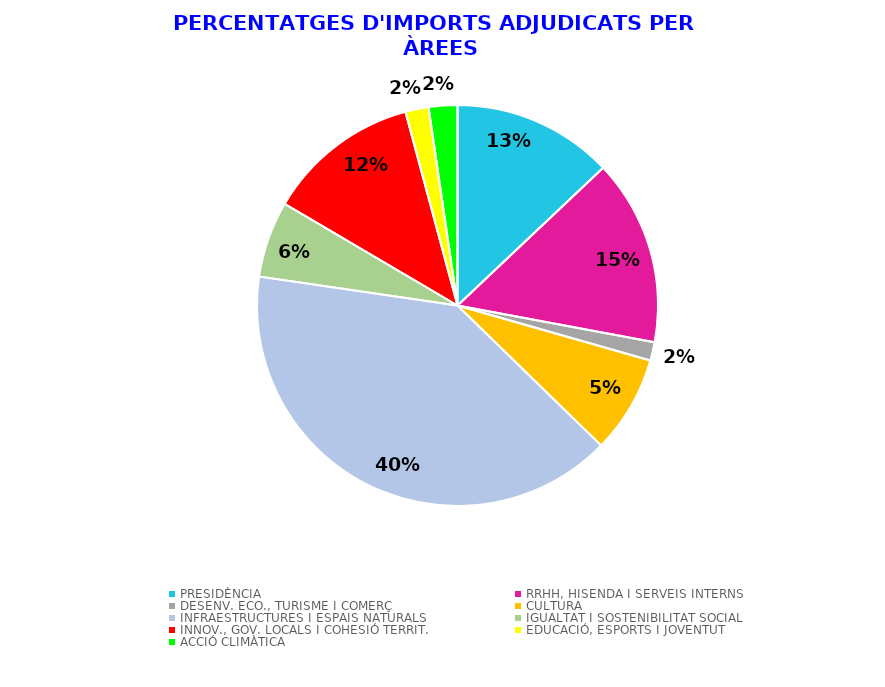
| Category | Series 0 |
|---|---|
| PRESIDÈNCIA | 0.129 |
| RRHH, HISENDA I SERVEIS INTERNS | 0.15 |
| DESENV. ECO., TURISME I COMERÇ | 0.015 |
| CULTURA | 0.079 |
| INFRAESTRUCTURES I ESPAIS NATURALS | 0.4 |
| IGUALTAT I SOSTENIBILITAT SOCIAL | 0.061 |
| INNOV., GOV. LOCALS I COHESIÓ TERRIT. | 0.124 |
| EDUCACIÓ, ESPORTS I JOVENTUT | 0.019 |
| ACCIÓ CLIMÀTICA | 0.023 |